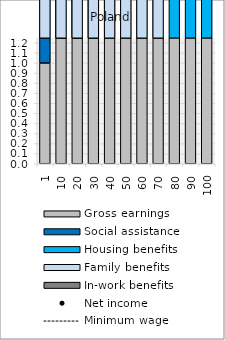
| Category | Gross earnings | Social assistance | Housing benefits | Family benefits | In-work benefits |
|---|---|---|---|---|---|
| 1.0 | 0.999 | 27.001 | 14.694 | 4.76 | 0 |
| 10.0 | 10.001 | 19.176 | 13.614 | 4.76 | 0 |
| 20.0 | 20 | 11.228 | 11.67 | 4.76 | 0 |
| 30.0 | 30 | 4.133 | 10.17 | 4.76 | 0 |
| 40.0 | 39.999 | 0 | 8.67 | 4.76 | 0 |
| 50.0 | 50 | 0 | 7.17 | 4.76 | 0 |
| 60.0 | 60.001 | 0 | 5.67 | 4.76 | 0 |
| 70.0 | 70 | 0 | 4.17 | 4.76 | 0 |
| 80.0 | 80 | 0 | 3.386 | 0 | 0 |
| 90.0 | 89.999 | 0 | 1.884 | 0 | 0 |
| 100.0 | 100 | 0 | 0.384 | 0 | 0 |